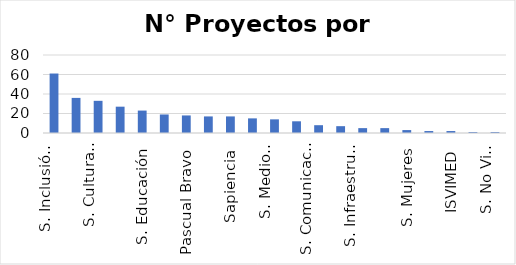
| Category | Proyectos |
|---|---|
| S. Inclusión Social | 61 |
| S. Participación Ciudadana | 36 |
| S. Cultura Ciudadana | 33 |
| INDER | 27 |
| S. Educación | 23 |
| Colmayor | 19 |
| Pascual Bravo | 18 |
| ITM | 17 |
| Sapiencia | 17 |
| S. Salud | 15 |
| S. Medio ambiente | 14 |
| S. Desarrollo Económico | 12 |
| S. Comunicaciones | 8 |
| S. Juventud | 7 |
| S. Infraestructura | 5 |
| S. Seguridad | 5 |
| S. Mujeres | 3 |
| Buen Comienzo | 2 |
| ISVIMED | 2 |
| DAGRD | 1 |
| S. No Violencia | 1 |